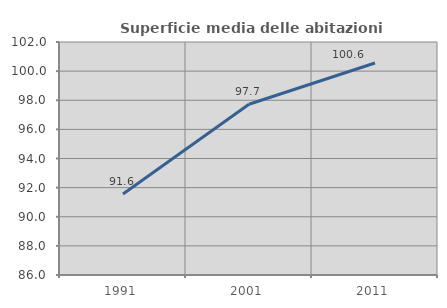
| Category | Superficie media delle abitazioni occupate |
|---|---|
| 1991.0 | 91.567 |
| 2001.0 | 97.724 |
| 2011.0 | 100.558 |